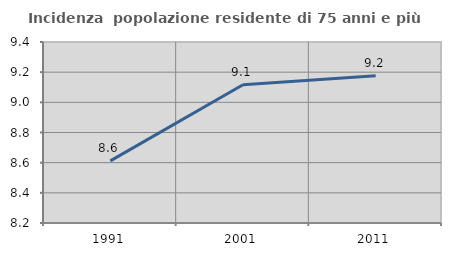
| Category | Incidenza  popolazione residente di 75 anni e più |
|---|---|
| 1991.0 | 8.612 |
| 2001.0 | 9.116 |
| 2011.0 | 9.177 |